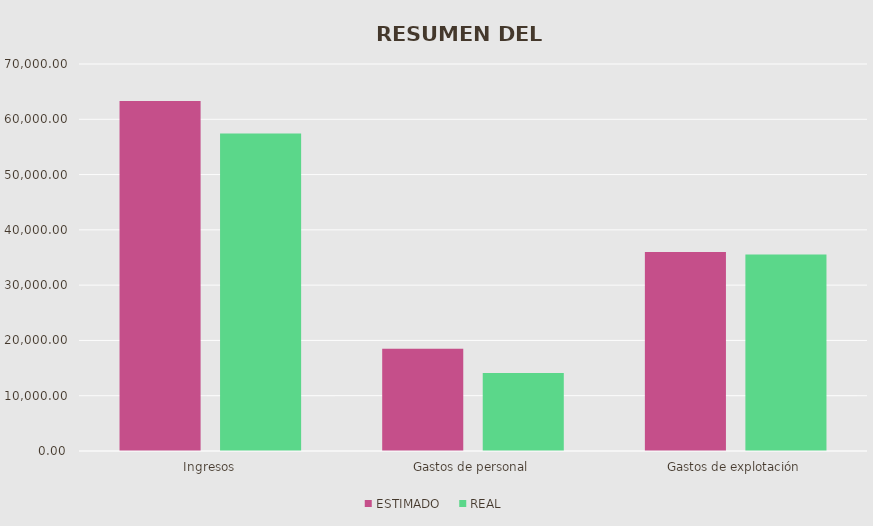
| Category | ESTIMADO | REAL |
|---|---|---|
| Ingresos | 63300 | 57450 |
| Gastos de personal | 18500 | 14100 |
| Gastos de explotación | 36000 | 35530 |